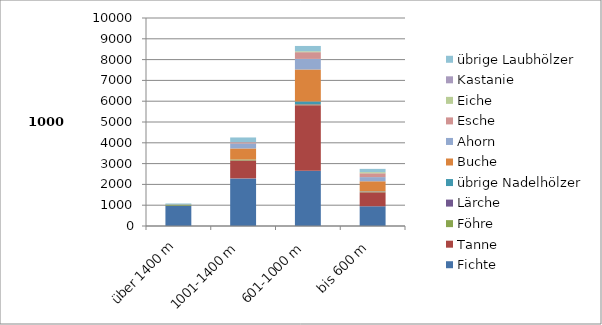
| Category | Fichte | Tanne | Föhre | Lärche | übrige Nadelhölzer | Buche | Ahorn | Esche | Eiche | Kastanie | übrige Laubhölzer |
|---|---|---|---|---|---|---|---|---|---|---|---|
| über 1400 m | 975.8 | 3.7 | 53.9 | 0 | 0 | 0 | 16.5 | 0 | 0 | 0 | 32.6 |
| 1001-1400 m | 2288.9 | 861.9 | 46.9 | 0.5 | 0.5 | 530 | 239.3 | 58.1 | 0 | 1.3 | 229 |
| 601-1000 m | 2661.8 | 3147.1 | 36.2 | 21.4 | 121.2 | 1537.9 | 507.4 | 323.9 | 43.1 | 1.8 | 254.4 |
| bis 600 m | 948.7 | 672 | 13 | 3.7 | 24.5 | 488.9 | 199.6 | 184.2 | 53.6 | 0.8 | 157.5 |